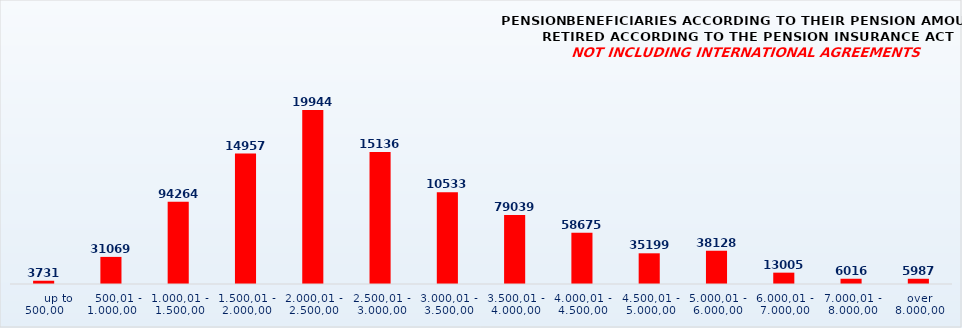
| Category | PENSION BENEFICIARIES ACCORDING TO TYPES AND AMOUNTS OF PENSION, RETIRED ACCORDING TO THE PENSION INSURANCE ACT
NOT INCLUDING INTERNATIONAL AGREEMENTS |
|---|---|
|       up to 500,00 | 3731 |
|    500,01 - 1.000,00 | 31069 |
| 1.000,01 - 1.500,00 | 94264 |
| 1.500,01 - 2.000,00 | 149579 |
| 2.000,01 - 2.500,00 | 199443 |
| 2.500,01 - 3.000,00 | 151366 |
| 3.000,01 - 3.500,00 | 105332 |
| 3.500,01 - 4.000,00 | 79039 |
| 4.000,01 - 4.500,00 | 58675 |
| 4.500,01 - 5.000,00 | 35199 |
| 5.000,01 - 6.000,00 | 38128 |
| 6.000,01 - 7.000,00 | 13005 |
| 7.000,01 - 8.000,00 | 6016 |
|  over  8.000,00 | 5987 |